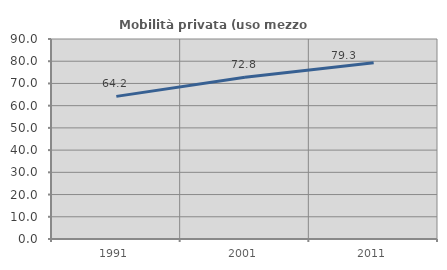
| Category | Mobilità privata (uso mezzo privato) |
|---|---|
| 1991.0 | 64.178 |
| 2001.0 | 72.773 |
| 2011.0 | 79.267 |